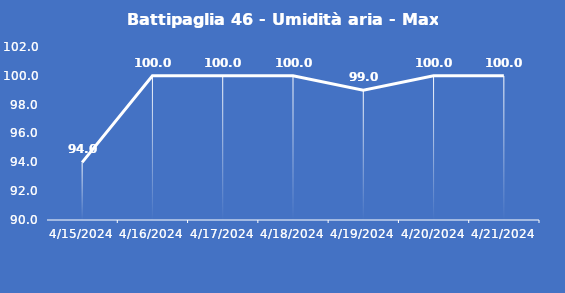
| Category | Battipaglia 46 - Umidità aria - Max (%) |
|---|---|
| 4/15/24 | 94 |
| 4/16/24 | 100 |
| 4/17/24 | 100 |
| 4/18/24 | 100 |
| 4/19/24 | 99 |
| 4/20/24 | 100 |
| 4/21/24 | 100 |